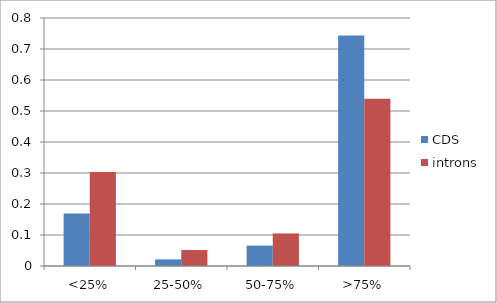
| Category | CDS | introns |
|---|---|---|
| <25% | 0.169 | 0.303 |
| 25-50% | 0.021 | 0.052 |
| 50-75% | 0.066 | 0.105 |
| >75% | 0.744 | 0.54 |